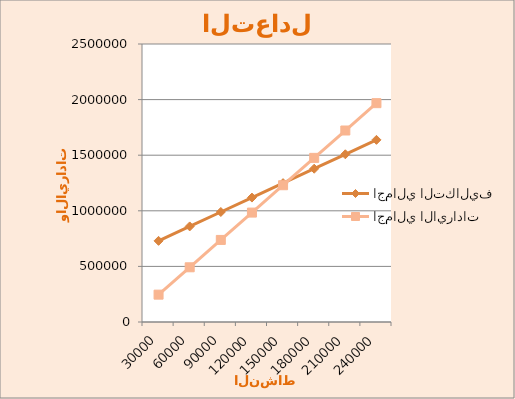
| Category | اجمالي التكاليف | اجمالي الايرادات |
|---|---|---|
| 30000.0 | 729750 | 246000 |
| 60000.0 | 859500 | 492000 |
| 90000.0 | 989250 | 738000 |
| 120000.0 | 1119000 | 984000 |
| 150000.0 | 1248750 | 1230000 |
| 180000.0 | 1378500 | 1476000 |
| 210000.0 | 1508250 | 1722000 |
| 240000.0 | 1638000 | 1968000 |